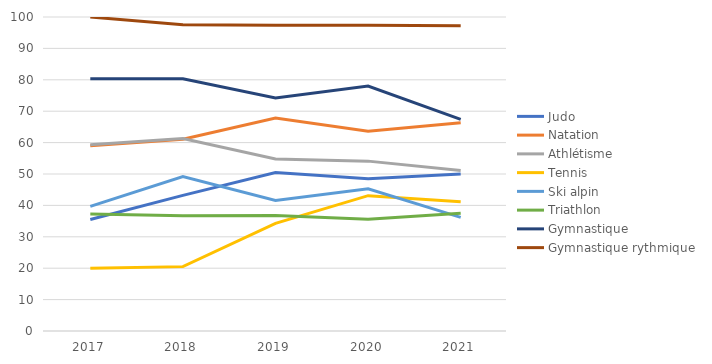
| Category | Judo | Natation | Athlétisme | Tennis | Ski alpin | Triathlon | Gymnastique | Gymnastique rythmique |
|---|---|---|---|---|---|---|---|---|
| 2017.0 | 35.5 | 59 | 59.3 | 20 | 39.7 | 37.3 | 80.3 | 100 |
| 2018.0 | 43.2 | 61.1 | 61.3 | 20.5 | 49.2 | 36.7 | 80.3 | 97.5 |
| 2019.0 | 50.5 | 67.8 | 54.8 | 34.3 | 41.6 | 36.8 | 74.2 | 97.4 |
| 2020.0 | 48.5 | 63.6 | 54.1 | 43.1 | 45.3 | 35.6 | 78 | 97.4 |
| 2021.0 | 50 | 66.3 | 51.1 | 41.2 | 36.2 | 37.5 | 67.4 | 97.2 |